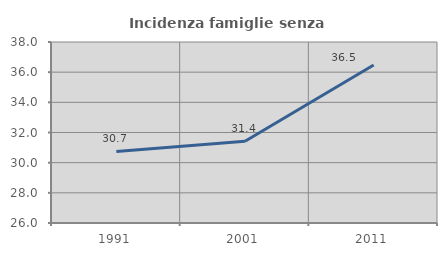
| Category | Incidenza famiglie senza nuclei |
|---|---|
| 1991.0 | 30.744 |
| 2001.0 | 31.424 |
| 2011.0 | 36.478 |